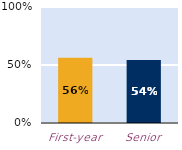
| Category | At least some |
|---|---|
| First-year | 0.563 |
| Senior | 0.543 |